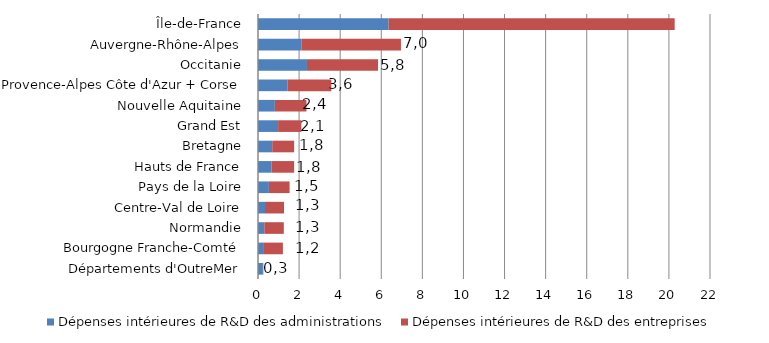
| Category | Dépenses intérieures de R&D des administrations | Dépenses intérieures de R&D des entreprises |
|---|---|---|
| Départements d'OutreMer | 237.966 | 21.183 |
| Bourgogne Franche-Comté | 249.689 | 961.756 |
| Normandie | 308.085 | 947.295 |
| Centre-Val de Loire | 340.404 | 925.922 |
| Pays de la Loire | 529.718 | 1008.11 |
| Hauts de France | 662.483 | 1096.569 |
| Bretagne | 692.762 | 1066.885 |
| Grand Est | 979.339 | 1130.164 |
| Nouvelle Aquitaine | 821.124 | 1536.566 |
| Provence-Alpes Côte d'Azur + Corse | 1443.725 | 2124.136 |
| Occitanie | 2383.592 | 3460.058 |
| Auvergne-Rhône-Alpes | 2127.937 | 4830.055 |
| Île-de-France | 6355.903 | 13925.201 |